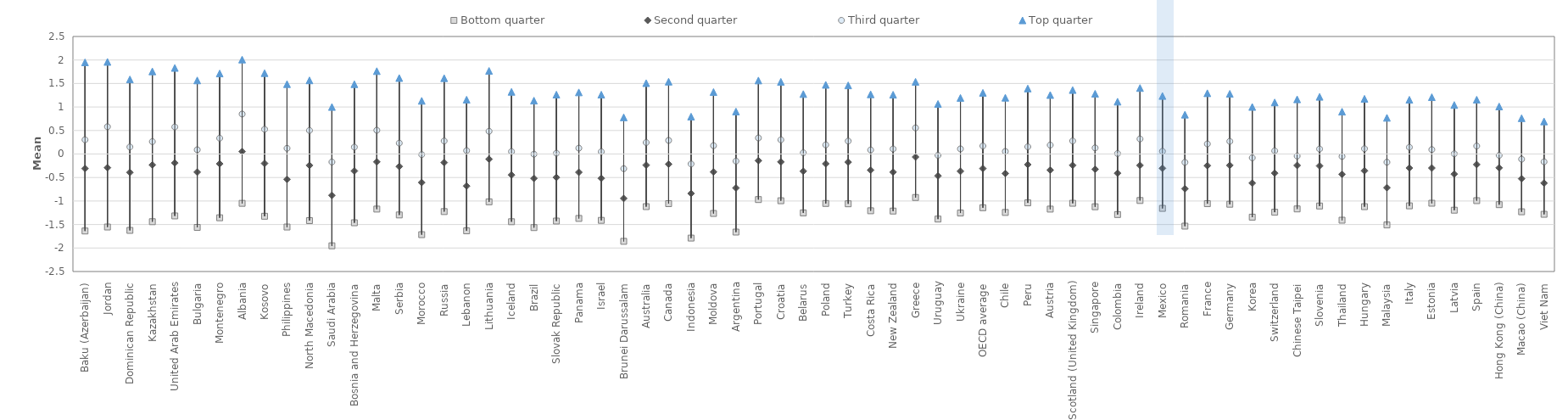
| Category | Bottom quarter | Second quarter | Third quarter | Top quarter  |
|---|---|---|---|---|
| Baku (Azerbaijan) | -1.638 | -0.308 | 0.303 | 1.949 |
| Jordan | -1.553 | -0.291 | 0.58 | 1.959 |
| Dominican Republic | -1.625 | -0.393 | 0.15 | 1.587 |
| Kazakhstan | -1.44 | -0.232 | 0.263 | 1.757 |
| United Arab Emirates | -1.317 | -0.19 | 0.576 | 1.831 |
| Bulgaria | -1.561 | -0.386 | 0.09 | 1.566 |
| Montenegro | -1.357 | -0.209 | 0.337 | 1.713 |
| Albania | -1.05 | 0.051 | 0.85 | 2.008 |
| Kosovo | -1.324 | -0.199 | 0.526 | 1.72 |
| Philippines | -1.553 | -0.539 | 0.121 | 1.486 |
| North Macedonia | -1.417 | -0.241 | 0.501 | 1.567 |
| Saudi Arabia | -1.953 | -0.879 | -0.17 | 1 |
| Bosnia and Herzegovina | -1.463 | -0.361 | 0.147 | 1.485 |
| Malta | -1.172 | -0.168 | 0.505 | 1.763 |
| Serbia | -1.296 | -0.266 | 0.231 | 1.616 |
| Morocco | -1.716 | -0.607 | -0.012 | 1.131 |
| Russia | -1.225 | -0.182 | 0.277 | 1.613 |
| Lebanon | -1.634 | -0.681 | 0.072 | 1.156 |
| Lithuania | -1.017 | -0.11 | 0.483 | 1.768 |
| Iceland | -1.441 | -0.446 | 0.052 | 1.322 |
| Brazil | -1.566 | -0.518 | -0.004 | 1.135 |
| Slovak Republic | -1.426 | -0.499 | 0.017 | 1.263 |
| Panama | -1.371 | -0.389 | 0.125 | 1.311 |
| Israel | -1.412 | -0.518 | 0.05 | 1.262 |
| Brunei Darussalam | -1.858 | -0.946 | -0.312 | 0.779 |
| Australia | -1.119 | -0.236 | 0.244 | 1.507 |
| Canada | -1.055 | -0.215 | 0.289 | 1.539 |
| Indonesia | -1.788 | -0.84 | -0.212 | 0.795 |
| Moldova | -1.265 | -0.382 | 0.178 | 1.319 |
| Argentina | -1.661 | -0.723 | -0.151 | 0.904 |
| Portugal | -0.969 | -0.142 | 0.342 | 1.564 |
| Croatia | -0.994 | -0.168 | 0.302 | 1.536 |
| Belarus | -1.253 | -0.366 | 0.026 | 1.275 |
| Poland | -1.052 | -0.208 | 0.194 | 1.472 |
| Turkey | -1.059 | -0.172 | 0.275 | 1.46 |
| Costa Rica | -1.207 | -0.343 | 0.086 | 1.269 |
| New Zealand | -1.214 | -0.385 | 0.108 | 1.261 |
| Greece | -0.925 | -0.064 | 0.555 | 1.536 |
| Uruguay | -1.384 | -0.466 | -0.027 | 1.065 |
| Ukraine | -1.255 | -0.367 | 0.109 | 1.193 |
| OECD average | -1.143 | -0.308 | 0.171 | 1.302 |
| Chile | -1.243 | -0.414 | 0.054 | 1.197 |
| Peru | -1.039 | -0.225 | 0.154 | 1.393 |
| Austria | -1.172 | -0.341 | 0.19 | 1.255 |
| Scotland (United Kingdom) | -1.048 | -0.239 | 0.277 | 1.361 |
| Singapore | -1.122 | -0.325 | 0.13 | 1.282 |
| Colombia | -1.288 | -0.409 | 0.01 | 1.113 |
| Ireland | -0.989 | -0.242 | 0.32 | 1.404 |
| Mexico | -1.157 | -0.305 | 0.057 | 1.234 |
| Romania | -1.534 | -0.739 | -0.177 | 0.837 |
| France | -1.057 | -0.248 | 0.215 | 1.293 |
| Germany | -1.068 | -0.242 | 0.269 | 1.281 |
| Korea | -1.343 | -0.62 | -0.081 | 1.001 |
| Switzerland | -1.238 | -0.408 | 0.067 | 1.097 |
| Chinese Taipei | -1.168 | -0.243 | -0.044 | 1.162 |
| Slovenia | -1.106 | -0.253 | 0.107 | 1.216 |
| Thailand | -1.408 | -0.431 | -0.052 | 0.901 |
| Hungary | -1.12 | -0.357 | 0.113 | 1.174 |
| Malaysia | -1.509 | -0.717 | -0.174 | 0.77 |
| Italy | -1.103 | -0.298 | 0.143 | 1.154 |
| Estonia | -1.047 | -0.298 | 0.094 | 1.209 |
| Latvia | -1.195 | -0.428 | 0.005 | 1.042 |
| Spain | -0.992 | -0.224 | 0.17 | 1.156 |
| Hong Kong (China) | -1.078 | -0.294 | -0.029 | 1.011 |
| Macao (China) | -1.229 | -0.525 | -0.11 | 0.762 |
| Viet Nam | -1.283 | -0.619 | -0.166 | 0.693 |